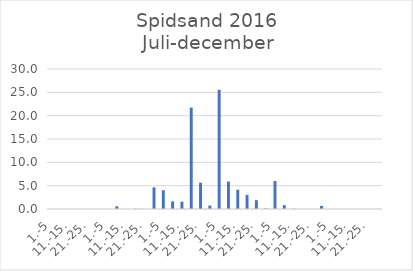
| Category | Series 0 |
|---|---|
| 1.-5 | 0 |
| 6.-10. | 0 |
| 11.-15. | 0 |
| 16.-20. | 0 |
| 21.-25. | 0 |
| 26.-31. | 0 |
| 1.-5 | 0 |
| 6.-10. | 0.588 |
| 11.-15. | 0 |
| 16.-20. | 0.075 |
| 21.-25. | 0 |
| 26.-31. | 4.638 |
| 1.-5 | 4.017 |
| 6.-10. | 1.638 |
| 11.-15. | 1.565 |
| 16.-20. | 21.737 |
| 21.-25. | 5.629 |
| 26.-30. | 0.731 |
| 1.-5 | 25.547 |
| 6.-10. | 5.879 |
| 11.-15. | 4.141 |
| 16.-20. | 3.021 |
| 21.-25. | 1.889 |
| 26.-31. | 0.108 |
| 1.-5 | 5.989 |
| 6.-10. | 0.816 |
| 11.-15. | 0.064 |
| 16.-20. | 0 |
| 21.-25. | 0 |
| 26.-30. | 0.667 |
| 1.-5 | 0 |
| 6.-10. | 0 |
| 11.-15. | 0 |
| 16.-20. | 0 |
| 21.-25. | 0 |
| 26.-31. | 0 |